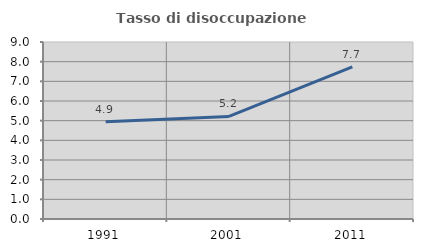
| Category | Tasso di disoccupazione giovanile  |
|---|---|
| 1991.0 | 4.942 |
| 2001.0 | 5.217 |
| 2011.0 | 7.732 |